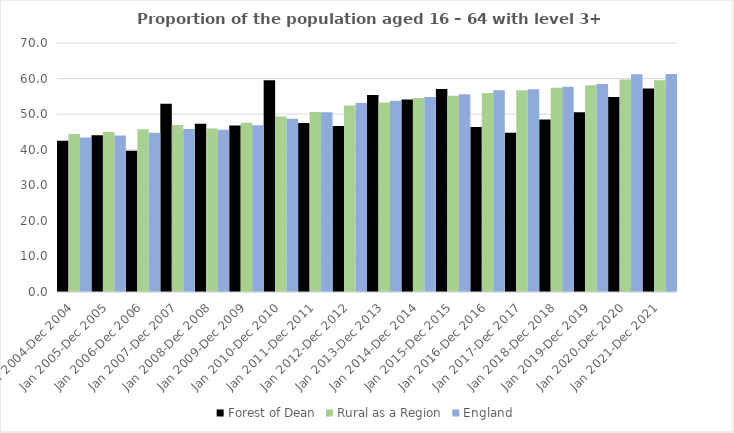
| Category | Forest of Dean | Rural as a Region | England |
|---|---|---|---|
| Jan 2004-Dec 2004 | 42.5 | 44.405 | 43.4 |
| Jan 2005-Dec 2005 | 44.1 | 44.973 | 44 |
| Jan 2006-Dec 2006 | 39.7 | 45.774 | 44.8 |
| Jan 2007-Dec 2007 | 52.9 | 46.968 | 45.8 |
| Jan 2008-Dec 2008 | 47.3 | 45.964 | 45.6 |
| Jan 2009-Dec 2009 | 46.8 | 47.59 | 46.9 |
| Jan 2010-Dec 2010 | 59.5 | 49.362 | 48.7 |
| Jan 2011-Dec 2011 | 47.5 | 50.602 | 50.5 |
| Jan 2012-Dec 2012 | 46.7 | 52.439 | 53.1 |
| Jan 2013-Dec 2013 | 55.4 | 53.276 | 53.8 |
| Jan 2014-Dec 2014 | 54.1 | 54.57 | 54.8 |
| Jan 2015-Dec 2015 | 57.1 | 55.16 | 55.6 |
| Jan 2016-Dec 2016 | 46.4 | 55.941 | 56.7 |
| Jan 2017-Dec 2017 | 44.8 | 56.689 | 57 |
| Jan 2018-Dec 2018 | 48.5 | 57.389 | 57.7 |
| Jan 2019-Dec 2019 | 50.5 | 58.147 | 58.5 |
| Jan 2020-Dec 2020 | 54.8 | 59.771 | 61.2 |
| Jan 2021-Dec 2021 | 57.2 | 59.54 | 61.3 |